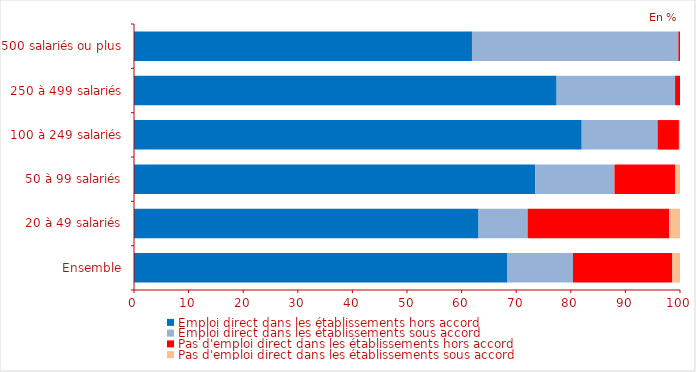
| Category | Emploi direct dans les établissements hors accord | Emploi direct dans les établissements sous accord | Pas d'emploi direct dans les établissements hors accord | Pas d'emploi direct dans les établissements sous accord |
|---|---|---|---|---|
| Ensemble | 68.4 | 12 | 18.2 | 1.4 |
| 20 à 49 salariés | 63.1 | 9 | 25.9 | 2 |
| 50 à 99 salariés | 73.5 | 14.5 | 11.1 | 0.9 |
| 100 à 249 salariés | 82 | 13.9 | 3.9 | 0.2 |
| 250 à 499 salariés | 77.4 | 21.7 | 0.9 | 0 |
| 500 salariés ou plus | 61.9 | 37.8 | 0.3 | 0 |